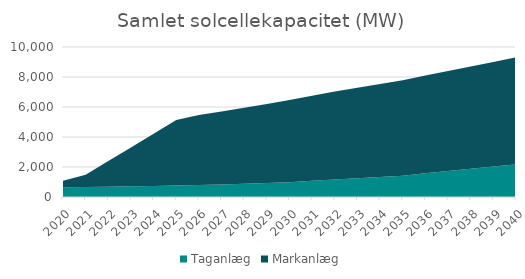
| Category | Taganlæg | Markanlæg |
|---|---|---|
| 2020.0 | 642 | 436.7 |
| 2021.0 | 661.424 | 820.868 |
| 2022.0 | 685.474 | 1706.43 |
| 2023.0 | 711.416 | 2591.992 |
| 2024.0 | 739.877 | 3477.554 |
| 2025.0 | 770.281 | 4363.116 |
| 2026.0 | 802.927 | 4663.116 |
| 2027.0 | 839.966 | 4863.116 |
| 2028.0 | 881.991 | 5063.116 |
| 2029.0 | 929.27 | 5263.116 |
| 2030.0 | 983.857 | 5483.116 |
| 2031.0 | 1076.257 | 5670.716 |
| 2032.0 | 1171.957 | 5865.016 |
| 2033.0 | 1251.157 | 6025.816 |
| 2034.0 | 1333.657 | 6193.316 |
| 2035.0 | 1416.157 | 6360.816 |
| 2036.0 | 1581.157 | 6525.816 |
| 2037.0 | 1731.157 | 6675.816 |
| 2038.0 | 1881.157 | 6825.816 |
| 2039.0 | 2031.157 | 6975.816 |
| 2040.0 | 2181.157 | 7125.816 |